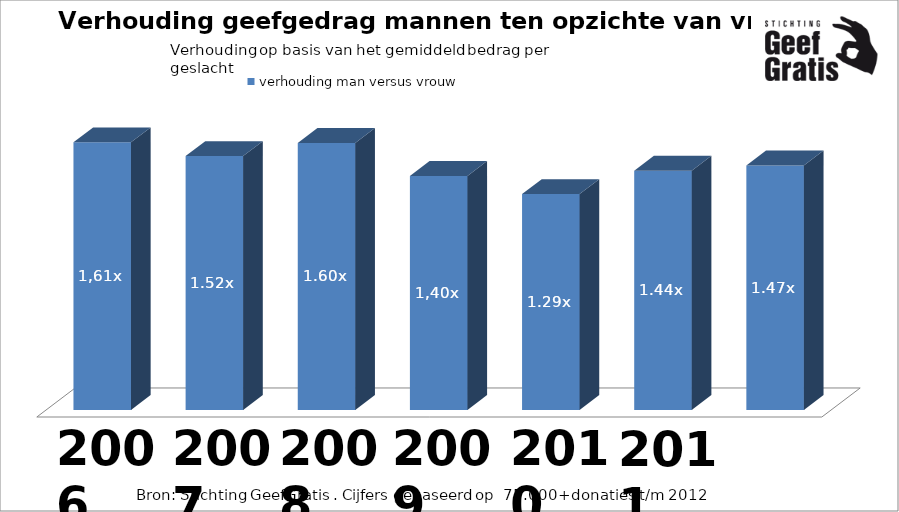
| Category | verhouding man versus vrouw |
|---|---|
| 1.605814668262916 | 1.606 |
| 1.5235784864166249 | 1.524 |
| 1.6017798352557848 | 1.602 |
| 1.4042231936623621 | 1.404 |